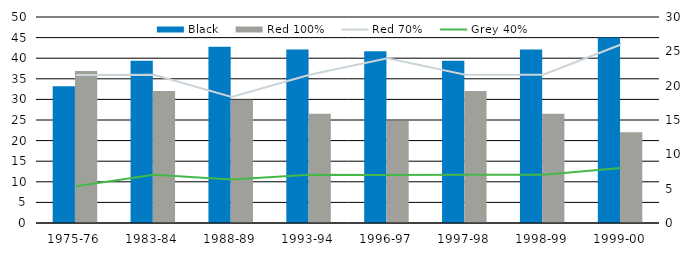
| Category | Black | Red 100% |
|---|---|---|
| 1975-76 | 33.19 | 36.88 |
| 1983-84 | 39.39 | 32.02 |
| 1988-89 | 42.78 | 29.91 |
| 1993-94 | 42.13 | 26.53 |
| 1996-97 | 41.69 | 24.76 |
| 1997-98 | 39.39 | 32.02 |
| 1998-99 | 42.13 | 26.53 |
| 1999-00 | 45 | 22 |